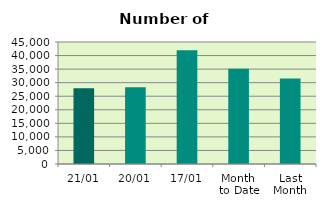
| Category | Series 0 |
|---|---|
| 21/01 | 27966 |
| 20/01 | 28266 |
| 17/01 | 41928 |
| Month 
to Date | 35119.143 |
| Last
Month | 31497.9 |